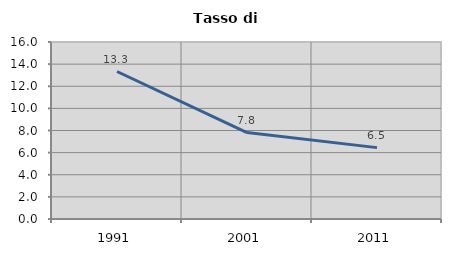
| Category | Tasso di disoccupazione   |
|---|---|
| 1991.0 | 13.333 |
| 2001.0 | 7.812 |
| 2011.0 | 6.452 |